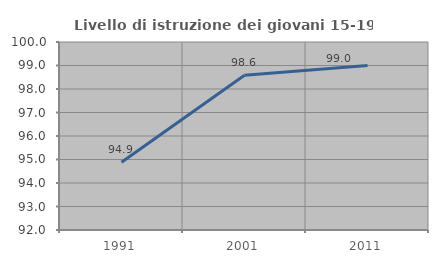
| Category | Livello di istruzione dei giovani 15-19 anni |
|---|---|
| 1991.0 | 94.887 |
| 2001.0 | 98.588 |
| 2011.0 | 99.005 |